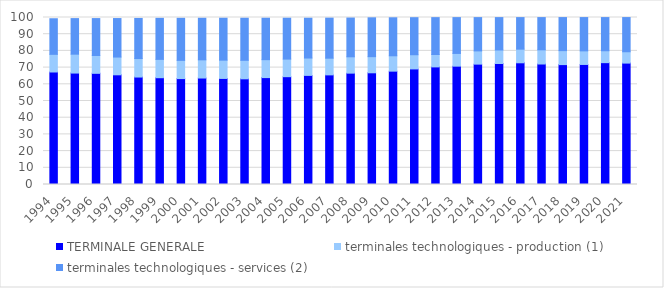
| Category | TERMINALE GENERALE | terminales technologiques - production (1) | terminales technologiques - services (2) |
|---|---|---|---|
| 1994.0 | 67.367 | 10.574 | 21.317 |
| 1995.0 | 66.729 | 11.306 | 21.305 |
| 1996.0 | 66.572 | 10.666 | 22.116 |
| 1997.0 | 65.686 | 10.628 | 23.059 |
| 1998.0 | 64.346 | 11.077 | 24.019 |
| 1999.0 | 63.95 | 10.976 | 24.576 |
| 2000.0 | 63.417 | 10.91 | 25.188 |
| 2001.0 | 63.758 | 10.887 | 24.896 |
| 2002.0 | 63.511 | 10.946 | 25.107 |
| 2003.0 | 63.279 | 11.079 | 25.197 |
| 2004.0 | 64.014 | 10.737 | 24.812 |
| 2005.0 | 64.561 | 10.526 | 24.479 |
| 2006.0 | 65.337 | 10.394 | 23.836 |
| 2007.0 | 65.642 | 9.999 | 23.974 |
| 2008.0 | 66.679 | 9.787 | 23.211 |
| 2009.0 | 66.888 | 9.662 | 23.263 |
| 2010.0 | 67.877 | 9.2 | 22.751 |
| 2011.0 | 69.205 | 8.505 | 22.175 |
| 2012.0 | 70.417 | 7.411 | 22.088 |
| 2013.0 | 70.865 | 7.623 | 21.444 |
| 2014.0 | 72.08 | 7.917 | 19.934 |
| 2015.0 | 72.459 | 8.082 | 19.396 |
| 2016.0 | 72.876 | 8.176 | 18.887 |
| 2017.0 | 72.15 | 8.492 | 19.304 |
| 2018.0 | 71.8 | 8.364 | 19.793 |
| 2019.0 | 71.884 | 8.134 | 19.94 |
| 2020.0 | 72.964 | 7.125 | 19.864 |
| 2021.0 | 72.698 | 6.787 | 20.473 |